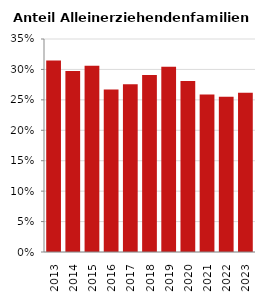
| Category | Anteil Alleinerziehende an Familien |
|---|---|
| 2013.0 | 0.315 |
| 2014.0 | 0.298 |
| 2015.0 | 0.306 |
| 2016.0 | 0.267 |
| 2017.0 | 0.276 |
| 2018.0 | 0.291 |
| 2019.0 | 0.304 |
| 2020.0 | 0.281 |
| 2021.0 | 0.259 |
| 2022.0 | 0.255 |
| 2023.0 | 0.262 |